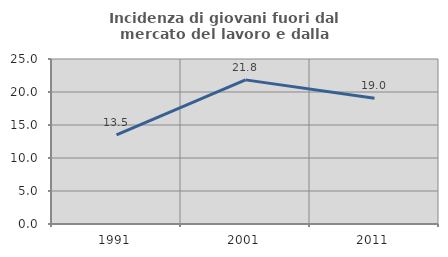
| Category | Incidenza di giovani fuori dal mercato del lavoro e dalla formazione  |
|---|---|
| 1991.0 | 13.499 |
| 2001.0 | 21.839 |
| 2011.0 | 19.048 |